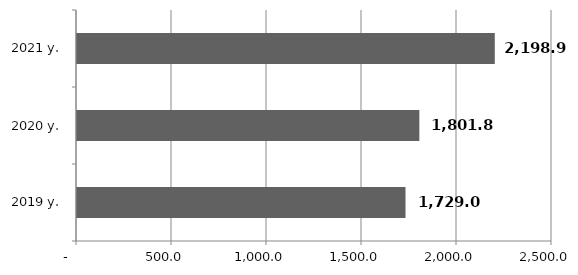
| Category | Series 0 |
|---|---|
| 2019 y. | 1729 |
| 2020 y. | 1801.8 |
| 2021 y. | 2198.9 |